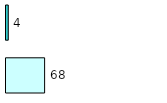
| Category | Series 0 | Series 1 |
|---|---|---|
| 0 | 68 | 4 |